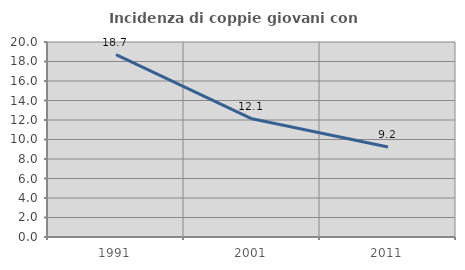
| Category | Incidenza di coppie giovani con figli |
|---|---|
| 1991.0 | 18.697 |
| 2001.0 | 12.124 |
| 2011.0 | 9.232 |